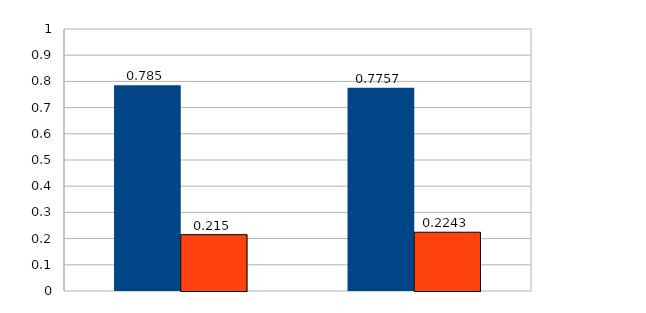
| Category | Series 0 | Series 1 |
|---|---|---|
| 0 | 0.785 | 0.215 |
| 1 | 0.776 | 0.224 |